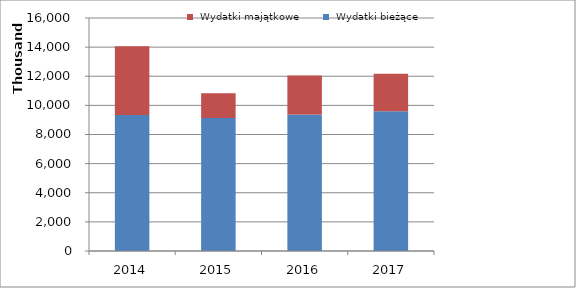
| Category |  Wydatki bieżące |  Wydatki majątkowe |
|---|---|---|
| 2014.0 | 9344048.48 | 4714500 |
| 2015.0 | 9140000 | 1685000 |
| 2016.0 | 9368000 | 2682000 |
| 2017.0 | 9600000 | 2570000 |